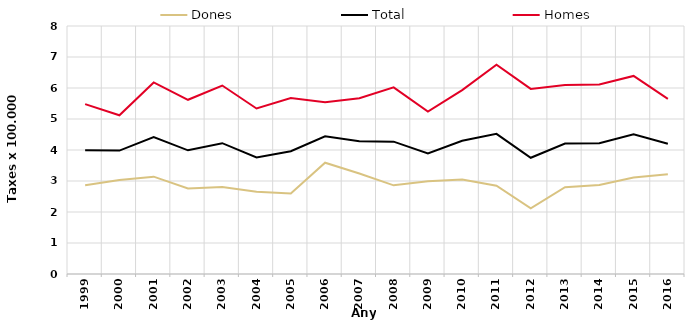
| Category | Dones | Total | Homes |
|---|---|---|---|
| 1999.0 | 2.86 | 3.99 | 5.48 |
| 2000.0 | 3.03 | 3.98 | 5.12 |
| 2001.0 | 3.14 | 4.42 | 6.18 |
| 2002.0 | 2.76 | 3.99 | 5.62 |
| 2003.0 | 2.81 | 4.22 | 6.08 |
| 2004.0 | 2.65 | 3.76 | 5.34 |
| 2005.0 | 2.6 | 3.96 | 5.68 |
| 2006.0 | 3.59 | 4.44 | 5.54 |
| 2007.0 | 3.24 | 4.28 | 5.67 |
| 2008.0 | 2.86 | 4.27 | 6.02 |
| 2009.0 | 2.99 | 3.89 | 5.24 |
| 2010.0 | 3.05 | 4.3 | 5.93 |
| 2011.0 | 2.85 | 4.52 | 6.75 |
| 2012.0 | 2.12 | 3.75 | 5.97 |
| 2013.0 | 2.8 | 4.21 | 6.1 |
| 2014.0 | 2.87 | 4.22 | 6.11 |
| 2015.0 | 3.11 | 4.51 | 6.39 |
| 2016.0 | 3.22 | 4.2 | 5.65 |